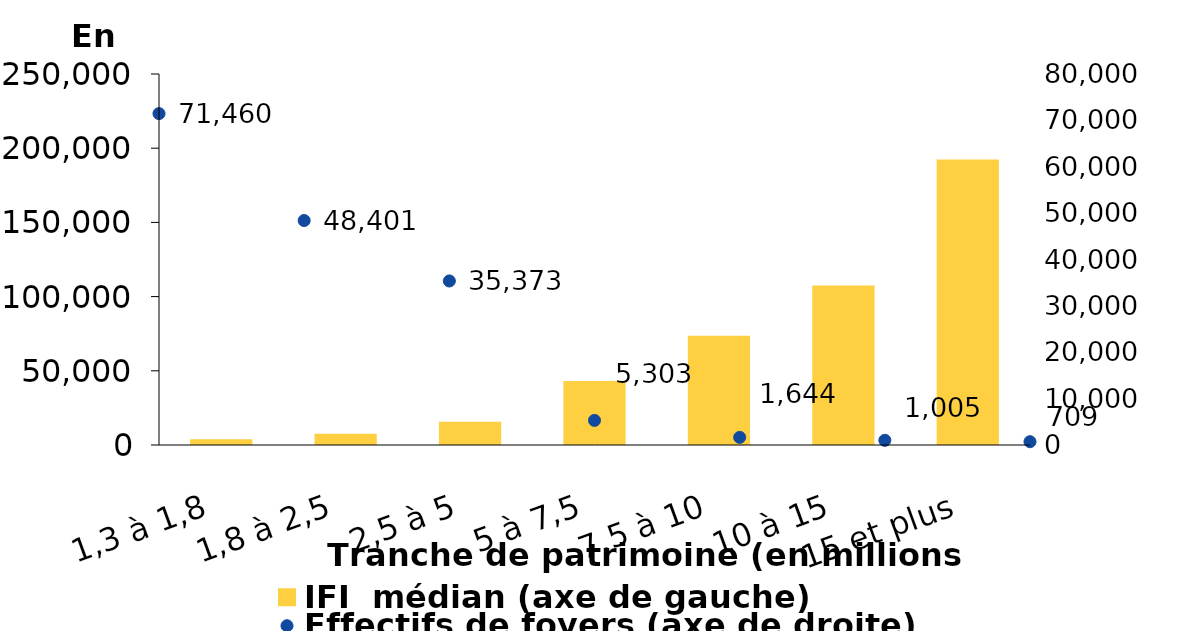
| Category | IFI  médian (axe de gauche) |
|---|---|
| 1,3 à 1,8 | 3886 |
| 1,8 à 2,5 | 7539 |
| 2,5 à 5 | 15591 |
| 5 à 7,5 | 43137 |
| 7,5 à 10 | 73594.5 |
| 10 à 15 | 107531 |
| 15 et plus | 192399 |